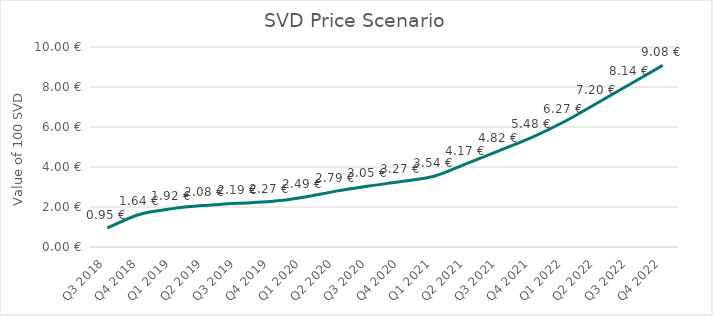
| Category | Expected token price for 100 SVD |
|---|---|
| Q3 2018 | 0.948 |
| Q4 2018 | 1.636 |
| Q1 2019 | 1.919 |
| Q2 2019 | 2.08 |
| Q3 2019 | 2.188 |
| Q4 2019 | 2.27 |
| Q1 2020 | 2.486 |
| Q2 2020 | 2.793 |
| Q3 2020 | 3.049 |
| Q4 2020 | 3.271 |
| Q1 2021 | 3.535 |
| Q2 2021 | 4.173 |
| Q3 2021 | 4.822 |
| Q4 2021 | 5.481 |
| Q1 2022 | 6.273 |
| Q2 2022 | 7.199 |
| Q3 2022 | 8.136 |
| Q4 2022 | 9.08 |